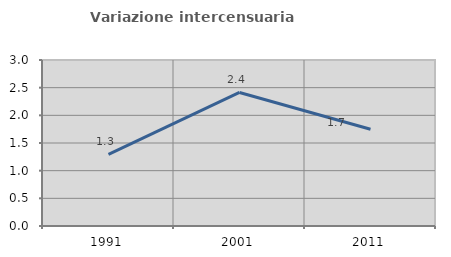
| Category | Variazione intercensuaria annua |
|---|---|
| 1991.0 | 1.295 |
| 2001.0 | 2.414 |
| 2011.0 | 1.749 |